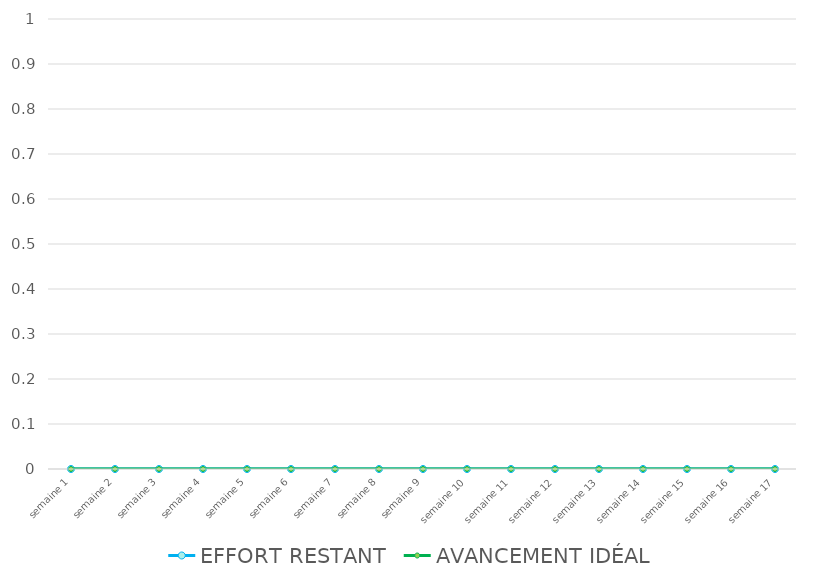
| Category | EFFORT RESTANT | AVANCEMENT IDÉAL |
|---|---|---|
| semaine 1 | 0 | 0 |
| semaine 2 | 0 | 0 |
| semaine 3 | 0 | 0 |
| semaine 4 | 0 | 0 |
| semaine 5 | 0 | 0 |
| semaine 6 | 0 | 0 |
| semaine 7 | 0 | 0 |
| semaine 8 | 0 | 0 |
| semaine 9 | 0 | 0 |
| semaine 10 | 0 | 0 |
| semaine 11 | 0 | 0 |
| semaine 12 | 0 | 0 |
| semaine 13 | 0 | 0 |
| semaine 14 | 0 | 0 |
| semaine 15 | 0 | 0 |
| semaine 16 | 0 | 0 |
| semaine 17 | 0 | 0 |